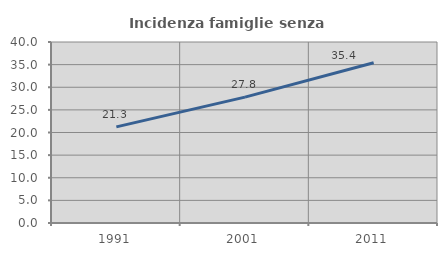
| Category | Incidenza famiglie senza nuclei |
|---|---|
| 1991.0 | 21.25 |
| 2001.0 | 27.816 |
| 2011.0 | 35.413 |